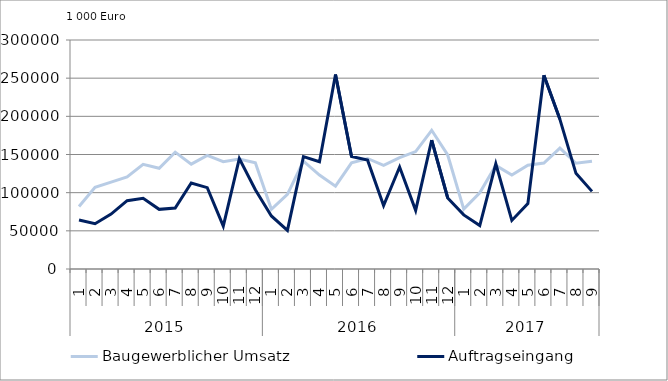
| Category | Baugewerblicher Umsatz | Auftragseingang |
|---|---|---|
| 0 | 81937.361 | 64244.383 |
| 1 | 106908.454 | 59377.677 |
| 2 | 113904.285 | 71953.971 |
| 3 | 120612.446 | 89496.024 |
| 4 | 137142.75 | 92563.213 |
| 5 | 132019.811 | 78131.737 |
| 6 | 153125.961 | 79765.729 |
| 7 | 137370.133 | 112637.987 |
| 8 | 148792.629 | 106572.56 |
| 9 | 140483.911 | 56073.767 |
| 10 | 144146.162 | 144643.688 |
| 11 | 139085.889 | 103931.175 |
| 12 | 78291.738 | 69470.357 |
| 13 | 97863.379 | 50640.033 |
| 14 | 141176.119 | 147206.65 |
| 15 | 123121.297 | 140579.009 |
| 16 | 108561.124 | 254739.334 |
| 17 | 139030.209 | 147481.644 |
| 18 | 144784.416 | 142609.658 |
| 19 | 135870.195 | 83192.156 |
| 20 | 145961.738 | 133594.351 |
| 21 | 153886.826 | 76793.838 |
| 22 | 181740.037 | 168867.568 |
| 23 | 149348.138 | 93011.853 |
| 24 | 78446.78 | 70908.903 |
| 25 | 99841.908 | 56868.408 |
| 26 | 135679.867 | 137790.423 |
| 27 | 123004.403 | 63637.761 |
| 28 | 136010.071 | 85644.63 |
| 29 | 138859.308 | 253791.552 |
| 30 | 158353.879 | 196034.198 |
| 31 | 138510.315 | 125319.873 |
| 32 | 141109.925 | 101690.626 |